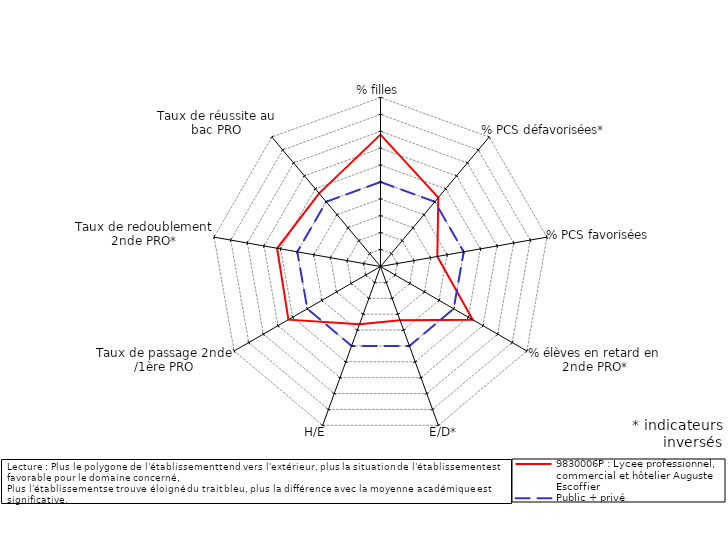
| Category | 9830006P : Lycee professionnel, commercial et hôtelier Auguste Escoffier | Public + privé |
|---|---|---|
| % filles | 2.802 | 0 |
| % PCS défavorisées* | 0.32 | 0 |
| % PCS favorisées | -1.585 | 0 |
| % élèves en retard en 2nde PRO* | 1.3 | 0 |
| E/D* | -1.61 | 0 |
| H/E | -1.371 | 0 |
| Taux de passage 2nde /1ère PRO | 1.292 | 0 |
| Taux de redoublement 2nde PRO* | 1.212 | 0 |
| Taux de réussite au bac PRO | 0.652 | 0 |